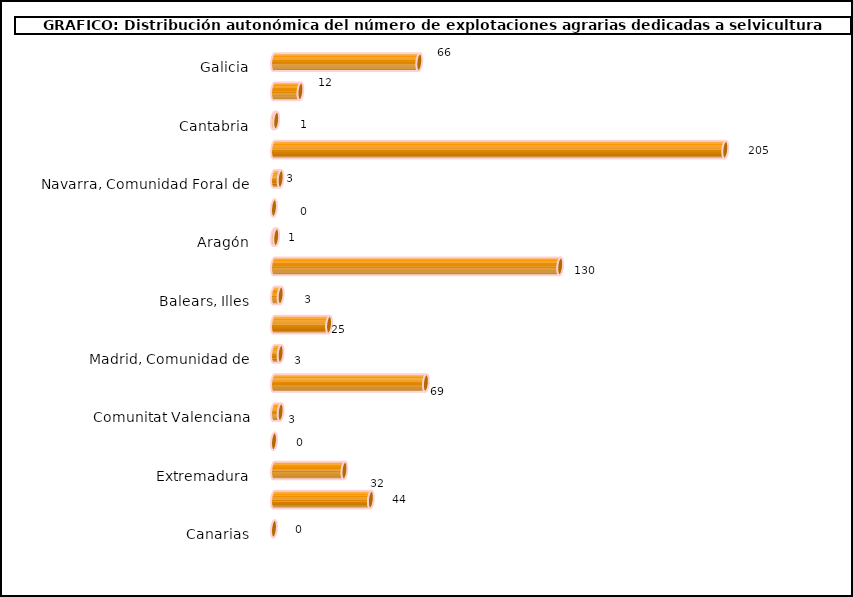
| Category | Series 0 |
|---|---|
| Galicia | 66 |
| Asturias, Principado de | 12 |
| Cantabria | 1 |
| País Vasco | 205 |
| Navarra, Comunidad Foral de | 3 |
| Rioja, La | 0 |
| Aragón | 1 |
| Cataluña | 130 |
| Balears, Illes | 3 |
| Castilla y León | 25 |
| Madrid, Comunidad de | 3 |
| Castilla - La Mancha | 69 |
| Comunitat Valenciana | 3 |
| Murcia, Región de | 0 |
| Extremadura | 32 |
| Andalucía | 44 |
| Canarias | 0 |